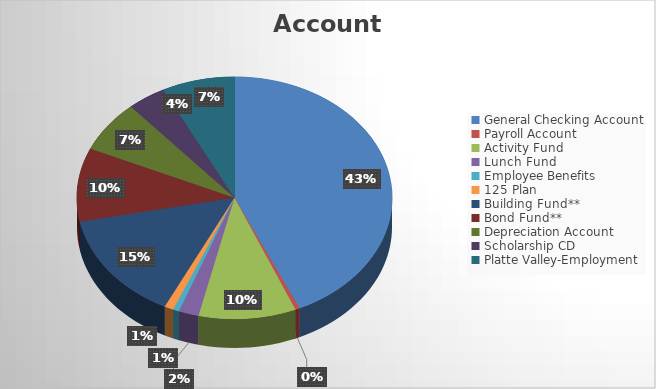
| Category | Series 0 |
|---|---|
| General Checking Account  | 916987.24 |
| Payroll Account | 9512.61 |
| Activity Fund | 211590.51 |
| Lunch Fund | 43739.49 |
| Employee Benefits | 13204.99 |
| 125 Plan | 19728.1 |
| Building Fund** | 308078.81 |
| Bond Fund** | 208542.42 |
| Depreciation Account | 147130.67 |
| Scholarship CD | 84064.59 |
| Platte Valley-Employment | 158067.29 |